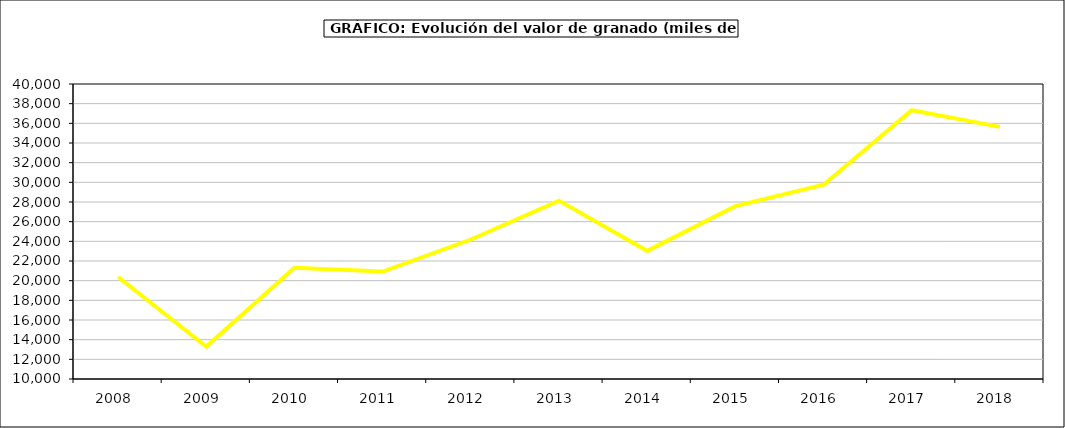
| Category | valor granado |
|---|---|
| 2008.0 | 20377.136 |
| 2009.0 | 13295.125 |
| 2010.0 | 21318.764 |
| 2011.0 | 20923.27 |
| 2012.0 | 24185.236 |
| 2013.0 | 28138.938 |
| 2014.0 | 23031.365 |
| 2015.0 | 27581 |
| 2016.0 | 29763 |
| 2017.0 | 37333.028 |
| 2018.0 | 35641.983 |